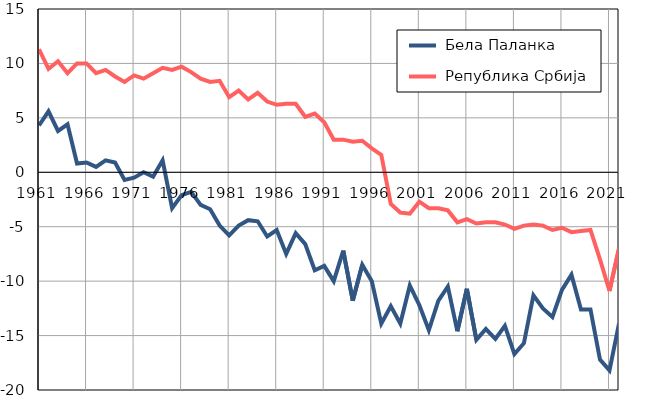
| Category |  Бела Паланка |  Република Србија |
|---|---|---|
| 1961.0 | 4.3 | 11.3 |
| 1962.0 | 5.6 | 9.5 |
| 1963.0 | 3.8 | 10.2 |
| 1964.0 | 4.4 | 9.1 |
| 1965.0 | 0.8 | 10 |
| 1966.0 | 0.9 | 10 |
| 1967.0 | 0.5 | 9.1 |
| 1968.0 | 1.1 | 9.4 |
| 1969.0 | 0.9 | 8.8 |
| 1970.0 | -0.7 | 8.3 |
| 1971.0 | -0.5 | 8.9 |
| 1972.0 | 0 | 8.6 |
| 1973.0 | -0.4 | 9.1 |
| 1974.0 | 1.1 | 9.6 |
| 1975.0 | -3.3 | 9.4 |
| 1976.0 | -2.1 | 9.7 |
| 1977.0 | -1.8 | 9.2 |
| 1978.0 | -3 | 8.6 |
| 1979.0 | -3.4 | 8.3 |
| 1980.0 | -4.9 | 8.4 |
| 1981.0 | -5.8 | 6.9 |
| 1982.0 | -4.9 | 7.5 |
| 1983.0 | -4.4 | 6.7 |
| 1984.0 | -4.5 | 7.3 |
| 1985.0 | -5.9 | 6.5 |
| 1986.0 | -5.3 | 6.2 |
| 1987.0 | -7.5 | 6.3 |
| 1988.0 | -5.6 | 6.3 |
| 1989.0 | -6.6 | 5.1 |
| 1990.0 | -9 | 5.4 |
| 1991.0 | -8.6 | 4.6 |
| 1992.0 | -10 | 3 |
| 1993.0 | -7.2 | 3 |
| 1994.0 | -11.8 | 2.8 |
| 1995.0 | -8.5 | 2.9 |
| 1996.0 | -10 | 2.2 |
| 1997.0 | -13.9 | 1.6 |
| 1998.0 | -12.3 | -2.9 |
| 1999.0 | -13.9 | -3.7 |
| 2000.0 | -10.4 | -3.8 |
| 2001.0 | -12.2 | -2.7 |
| 2002.0 | -14.5 | -3.3 |
| 2003.0 | -11.8 | -3.3 |
| 2004.0 | -10.5 | -3.5 |
| 2005.0 | -14.6 | -4.6 |
| 2006.0 | -10.7 | -4.3 |
| 2007.0 | -15.4 | -4.7 |
| 2008.0 | -14.4 | -4.6 |
| 2009.0 | -15.3 | -4.6 |
| 2010.0 | -14.1 | -4.8 |
| 2011.0 | -16.7 | -5.2 |
| 2012.0 | -15.7 | -4.9 |
| 2013.0 | -11.3 | -4.8 |
| 2014.0 | -12.5 | -4.9 |
| 2015.0 | -13.3 | -5.3 |
| 2016.0 | -10.8 | -5.1 |
| 2017.0 | -9.4 | -5.5 |
| 2018.0 | -12.6 | -5.4 |
| 2019.0 | -12.6 | -5.3 |
| 2020.0 | -17.2 | -8 |
| 2021.0 | -18.2 | -10.9 |
| 2022.0 | -13.9 | -7 |